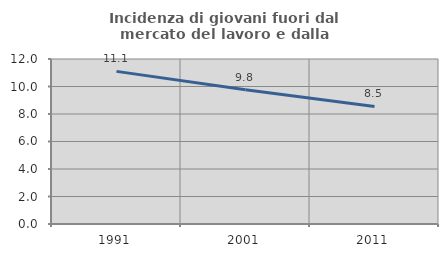
| Category | Incidenza di giovani fuori dal mercato del lavoro e dalla formazione  |
|---|---|
| 1991.0 | 11.101 |
| 2001.0 | 9.769 |
| 2011.0 | 8.548 |